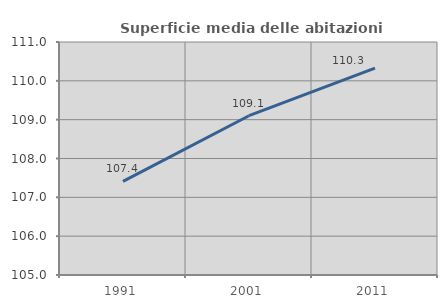
| Category | Superficie media delle abitazioni occupate |
|---|---|
| 1991.0 | 107.412 |
| 2001.0 | 109.102 |
| 2011.0 | 110.33 |